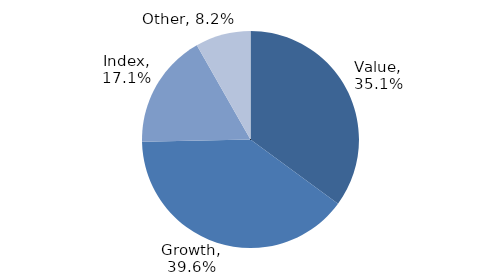
| Category | Investment Style |
|---|---|
| Value | 0.351 |
| Growth | 0.396 |
| Index | 0.171 |
| Other | 0.082 |